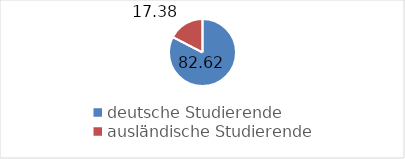
| Category | Series 0 |
|---|---|
| deutsche Studierende | 82.617 |
| ausländische Studierende | 17.383 |